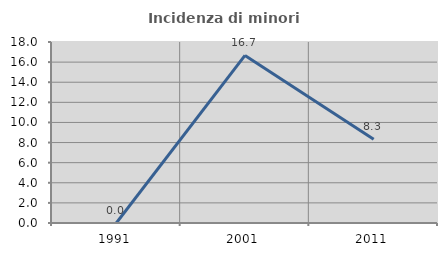
| Category | Incidenza di minori stranieri |
|---|---|
| 1991.0 | 0 |
| 2001.0 | 16.667 |
| 2011.0 | 8.333 |